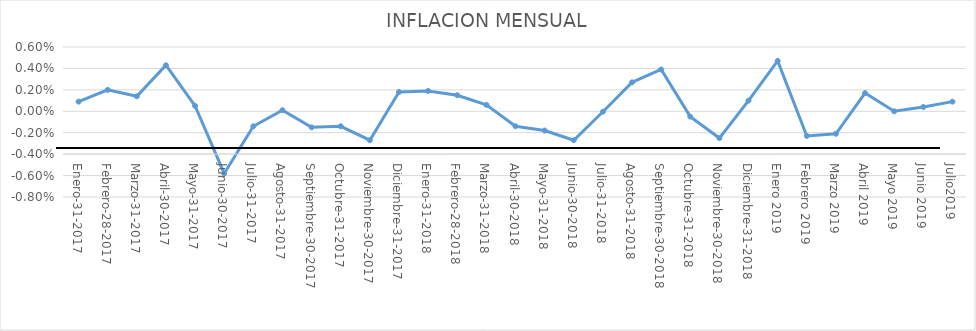
| Category | VALOR |
|---|---|
| Enero-31-2017 | 0.001 |
| Febrero-28-2017 | 0.002 |
| Marzo-31-2017 | 0.001 |
| Abril-30-2017 | 0.004 |
| Mayo-31-2017 | 0 |
| Junio-30-2017 | -0.006 |
| Julio-31-2017 | -0.001 |
| Agosto-31-2017 | 0 |
| Septiembre-30-2017 | -0.002 |
| Octubre-31-2017 | -0.001 |
| Noviembre-30-2017 | -0.003 |
| Diciembre-31-2017 | 0.002 |
| Enero-31-2018 | 0.002 |
| Febrero-28-2018 | 0.002 |
| Marzo-31-2018 | 0.001 |
| Abril-30-2018 | -0.001 |
| Mayo-31-2018 | -0.002 |
| Junio-30-2018 | -0.003 |
| Julio-31-2018 | 0 |
| Agosto-31-2018 | 0.003 |
| Septiembre-30-2018 | 0.004 |
| Octubre-31-2018 | 0 |
| Noviembre-30-2018 | -0.002 |
| Diciembre-31-2018 | 0.001 |
| Enero 2019 | 0.005 |
| Febrero 2019 | -0.002 |
| Marzo 2019 | -0.002 |
| Abril 2019 | 0.002 |
| Mayo 2019 | 0 |
| Junio 2019 | 0 |
| Julio2019 | 0.001 |